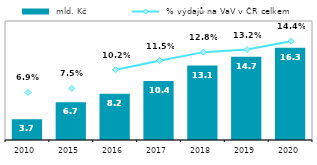
| Category |  mld. Kč |
|---|---|
| 2010.0 | 3.664 |
| 2015.0 | 6.651 |
| 2016.0 | 8.182 |
| 2017.0 | 10.424 |
| 2018.0 | 13.125 |
| 2019.0 | 14.683 |
| 2020.0 | 16.284 |